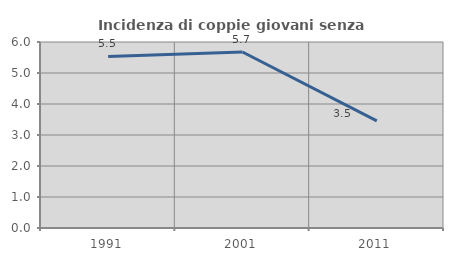
| Category | Incidenza di coppie giovani senza figli |
|---|---|
| 1991.0 | 5.536 |
| 2001.0 | 5.678 |
| 2011.0 | 3.454 |